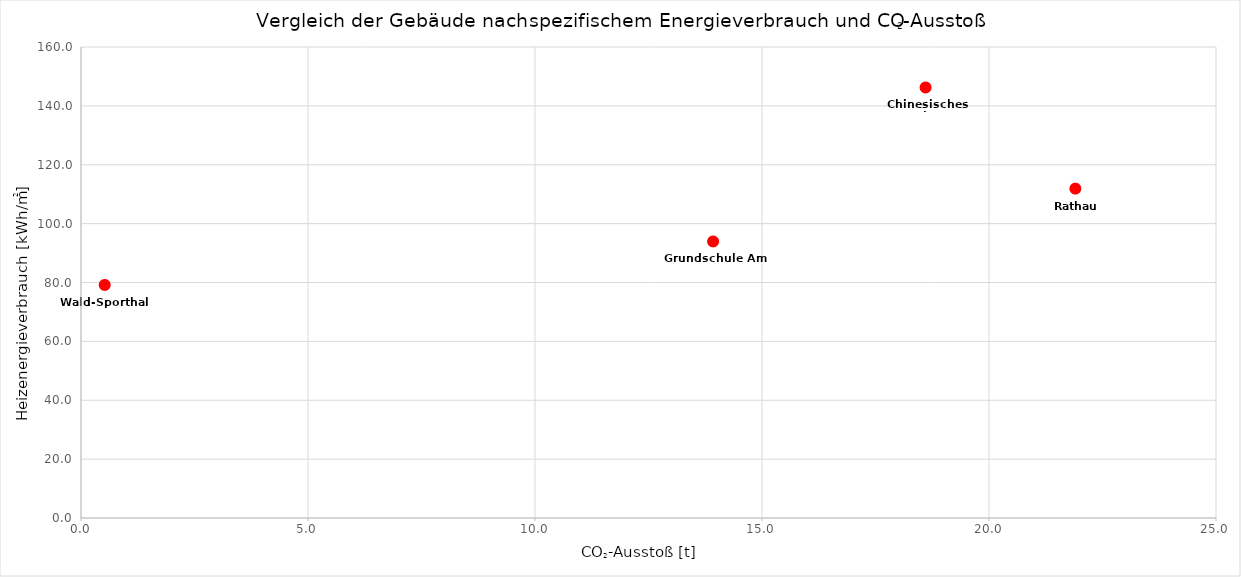
| Category | Heizenergieverbrauch spezifisch ohne Warmwasser-Anteil [kWh pro m²] |
|---|---|
| 13.922566666666667 | 93.944 |
| 21.90225 | 111.889 |
| 0.5225 | 79.167 |
| 18.603 | 146.25 |
| #N/A | 0 |
| #N/A | 0 |
| #N/A | 0 |
| #N/A | 0 |
| #N/A | 0 |
| #N/A | 0 |
| #N/A | 0 |
| #N/A | 0 |
| #N/A | 0 |
| #N/A | 0 |
| #N/A | 0 |
| #N/A | 0 |
| #N/A | 0 |
| #N/A | 0 |
| #N/A | 0 |
| #N/A | 0 |
| #N/A | 0 |
| #N/A | 0 |
| #N/A | 0 |
| #N/A | 0 |
| #N/A | 0 |
| #N/A | 0 |
| #N/A | 0 |
| #N/A | 0 |
| #N/A | 0 |
| #N/A | 0 |